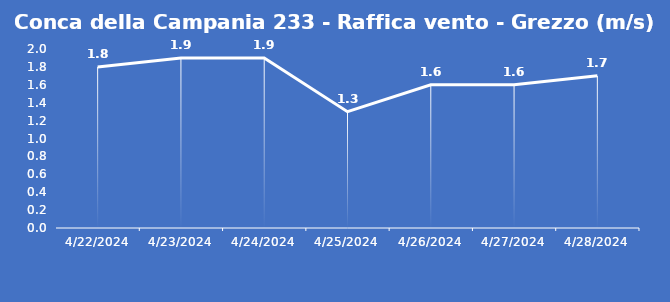
| Category | Conca della Campania 233 - Raffica vento - Grezzo (m/s) |
|---|---|
| 4/22/24 | 1.8 |
| 4/23/24 | 1.9 |
| 4/24/24 | 1.9 |
| 4/25/24 | 1.3 |
| 4/26/24 | 1.6 |
| 4/27/24 | 1.6 |
| 4/28/24 | 1.7 |